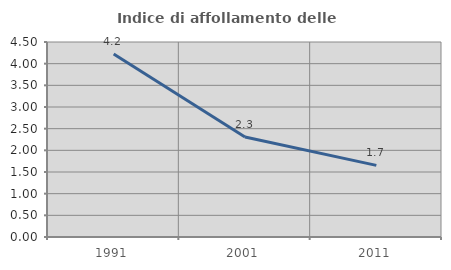
| Category | Indice di affollamento delle abitazioni  |
|---|---|
| 1991.0 | 4.224 |
| 2001.0 | 2.307 |
| 2011.0 | 1.653 |